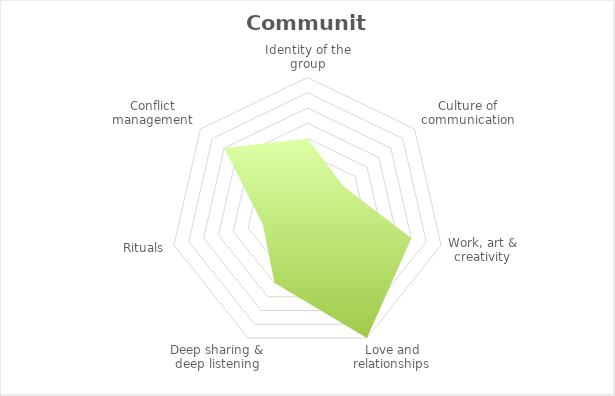
| Category | Series 0 |
|---|---|
| Identity of the group | 2.5 |
| Culture of communication | 1.5 |
| Work, art & creativity | 3.5 |
| Love and relationships | 4.5 |
| Deep sharing & deep listening | 2.5 |
| Rituals | 1.5 |
| Conflict management | 3.5 |